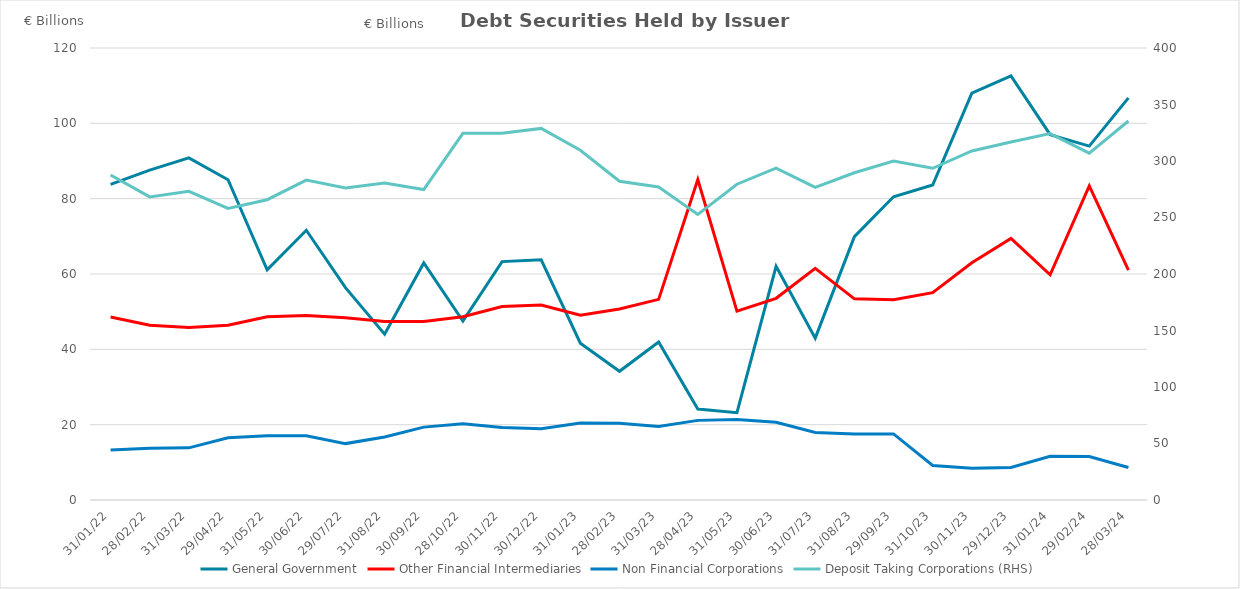
| Category | General Government | Other Financial Intermediaries | Non Financial Corporations |
|---|---|---|---|
| 2022-01-31 | 83.795 | 48.578 | 13.243 |
| 2022-02-28 | 87.582 | 46.39 | 13.771 |
| 2022-03-31 | 90.84 | 45.781 | 13.841 |
| 2022-04-29 | 85.033 | 46.398 | 16.497 |
| 2022-05-31 | 61.12 | 48.621 | 17.055 |
| 2022-06-30 | 71.613 | 48.983 | 17.08 |
| 2022-07-29 | 56.366 | 48.41 | 14.973 |
| 2022-08-31 | 44.033 | 47.374 | 16.747 |
| 2022-09-30 | 62.942 | 47.368 | 19.35 |
| 2022-10-28 | 47.526 | 48.643 | 20.217 |
| 2022-11-30 | 63.288 | 51.388 | 19.222 |
| 2022-12-30 | 63.785 | 51.765 | 18.912 |
| 2023-01-31 | 41.639 | 49.074 | 20.453 |
| 2023-02-28 | 34.164 | 50.702 | 20.392 |
| 2023-03-31 | 41.933 | 53.268 | 19.501 |
| 2023-04-28 | 24.128 | 85.071 | 21.14 |
| 2023-05-31 | 23.19 | 50.155 | 21.391 |
| 2023-06-30 | 62.05 | 53.548 | 20.652 |
| 2023-07-31 | 42.972 | 61.521 | 17.919 |
| 2023-08-31 | 69.911 | 53.397 | 17.544 |
| 2023-09-29 | 80.515 | 53.164 | 17.541 |
| 2023-10-31 | 83.624 | 55.054 | 9.176 |
| 2023-11-30 | 108.02 | 62.96 | 8.423 |
| 2023-12-29 | 112.617 | 69.449 | 8.623 |
| 2024-01-31 | 96.992 | 59.796 | 11.614 |
| 2024-02-29 | 93.958 | 83.378 | 11.546 |
| 2024-03-28 | 106.755 | 61.028 | 8.627 |